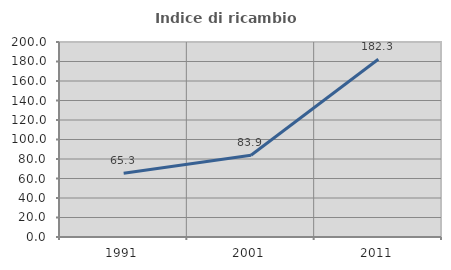
| Category | Indice di ricambio occupazionale  |
|---|---|
| 1991.0 | 65.302 |
| 2001.0 | 83.891 |
| 2011.0 | 182.292 |